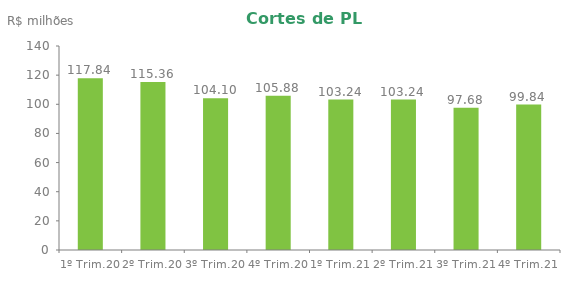
| Category | Series 0 |
|---|---|
| 1º Trim.20 | 117.839 |
| 2º Trim.20 | 115.362 |
| 3º Trim.20 | 104.099 |
| 4º Trim.20 | 105.884 |
| 1º Trim.21 | 103.241 |
| 2º Trim.21 | 103.241 |
| 3º Trim.21 | 97.678 |
| 4º Trim.21 | 99.84 |